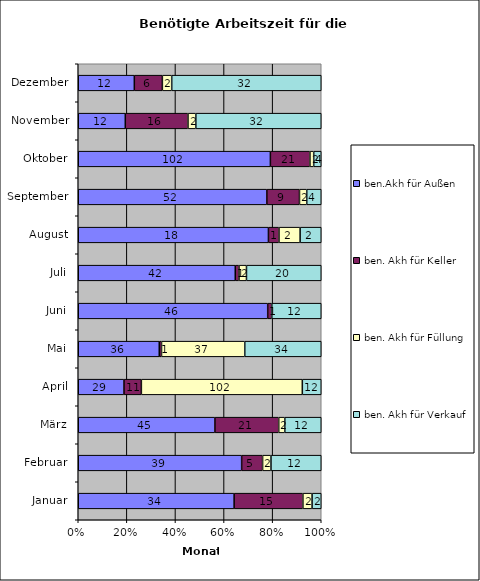
| Category | ben.Akh für Außen | ben. Akh für Keller | ben. Akh für Füllung | ben. Akh für Verkauf |
|---|---|---|---|---|
| Januar | 34 | 15 | 2 | 2 |
| Februar | 39 | 5 | 2 | 12 |
| März | 45 | 21 | 2 | 12 |
| April | 29 | 11 | 102 | 12 |
| Mai | 36 | 1 | 37 | 34 |
| Juni | 46 | 1 | 0 | 12 |
| Juli | 42 | 1 | 2 | 20 |
| August | 18 | 1 | 2 | 2 |
| September | 52 | 9 | 2 | 4 |
| Oktober | 102 | 21 | 2 | 4 |
| November | 12 | 16 | 2 | 32 |
| Dezember | 12 | 6 | 2 | 32 |